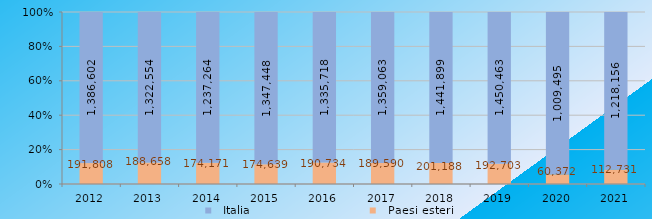
| Category |   Paesi esteri |   Italia |
|---|---|---|
| 2012 | 191808 | 1386602 |
| 2013 | 188658 | 1322554 |
| 2014 | 174171 | 1237264 |
| 2015 | 174639 | 1347448 |
| 2016 | 190734 | 1335718 |
| 2017 | 189590 | 1359063 |
| 2018 | 201188 | 1441899 |
| 2019 | 192703 | 1450463 |
| 2020 | 60372 | 1009495 |
| 2021 | 112731 | 1218156 |